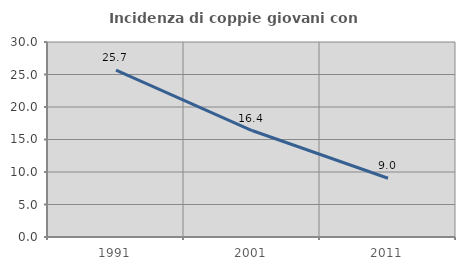
| Category | Incidenza di coppie giovani con figli |
|---|---|
| 1991.0 | 25.657 |
| 2001.0 | 16.383 |
| 2011.0 | 9.043 |